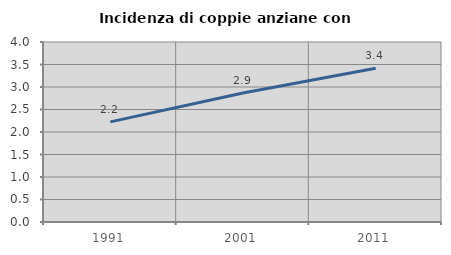
| Category | Incidenza di coppie anziane con figli |
|---|---|
| 1991.0 | 2.225 |
| 2001.0 | 2.868 |
| 2011.0 | 3.415 |